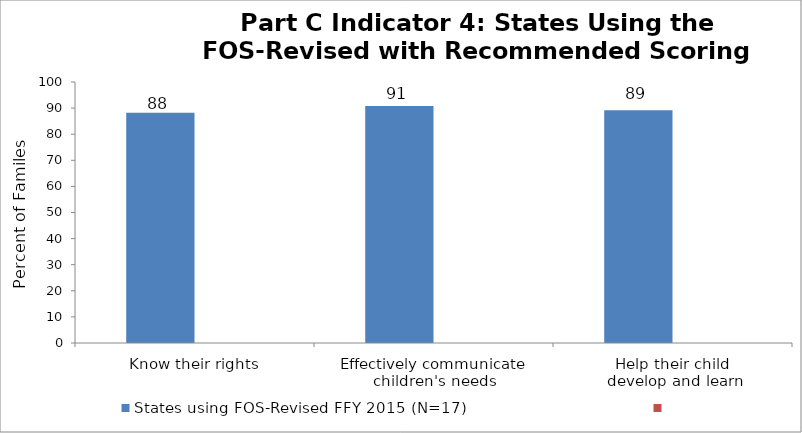
| Category | States using FOS-Revised FFY 2015 (N=17) | Series 1 |
|---|---|---|
| Know their rights | 88.2 |  |
| Effectively communicate 
children's needs | 90.8 |  |
| Help their child 
develop and learn | 89.2 |  |